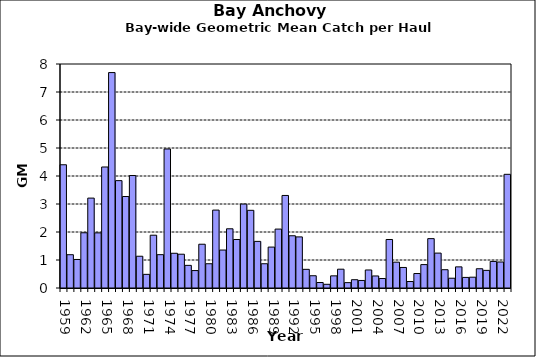
| Category | Series 0 |
|---|---|
| 1959.0 | 4.402 |
| 1960.0 | 1.189 |
| 1961.0 | 1.019 |
| 1962.0 | 1.972 |
| 1963.0 | 3.211 |
| 1964.0 | 1.969 |
| 1965.0 | 4.321 |
| 1966.0 | 7.694 |
| 1967.0 | 3.835 |
| 1968.0 | 3.267 |
| 1969.0 | 4.017 |
| 1970.0 | 1.134 |
| 1971.0 | 0.487 |
| 1972.0 | 1.885 |
| 1973.0 | 1.191 |
| 1974.0 | 4.965 |
| 1975.0 | 1.24 |
| 1976.0 | 1.207 |
| 1977.0 | 0.808 |
| 1978.0 | 0.623 |
| 1979.0 | 1.563 |
| 1980.0 | 0.866 |
| 1981.0 | 2.783 |
| 1982.0 | 1.356 |
| 1983.0 | 2.115 |
| 1984.0 | 1.732 |
| 1985.0 | 2.998 |
| 1986.0 | 2.774 |
| 1987.0 | 1.665 |
| 1988.0 | 0.866 |
| 1989.0 | 1.461 |
| 1990.0 | 2.104 |
| 1991.0 | 3.305 |
| 1992.0 | 1.866 |
| 1993.0 | 1.825 |
| 1994.0 | 0.666 |
| 1995.0 | 0.438 |
| 1996.0 | 0.196 |
| 1997.0 | 0.132 |
| 1998.0 | 0.434 |
| 1999.0 | 0.671 |
| 2000.0 | 0.191 |
| 2001.0 | 0.296 |
| 2002.0 | 0.269 |
| 2003.0 | 0.644 |
| 2004.0 | 0.43 |
| 2005.0 | 0.339 |
| 2006.0 | 1.732 |
| 2007.0 | 0.923 |
| 2008.0 | 0.734 |
| 2009.0 | 0.232 |
| 2010.0 | 0.517 |
| 2011.0 | 0.836 |
| 2012.0 | 1.763 |
| 2013.0 | 1.246 |
| 2014.0 | 0.653 |
| 2015.0 | 0.349 |
| 2016.0 | 0.755 |
| 2017.0 | 0.378 |
| 2018.0 | 0.386 |
| 2019.0 | 0.688 |
| 2020.0 | 0.63 |
| 2021.0 | 0.949 |
| 2022.0 | 0.929 |
| 2023.0 | 4.06 |